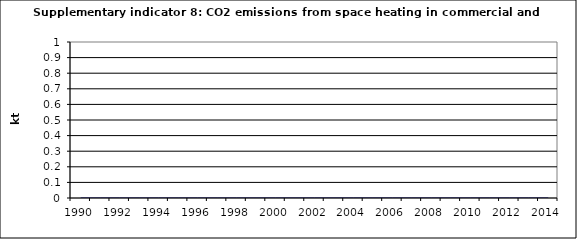
| Category | CO2 emissions from space heating in commercial and institutional, kt |
|---|---|
| 1990 | 0 |
| 1991 | 0 |
| 1992 | 0 |
| 1993 | 0 |
| 1994 | 0 |
| 1995 | 0 |
| 1996 | 0 |
| 1997 | 0 |
| 1998 | 0 |
| 1999 | 0 |
| 2000 | 0 |
| 2001 | 0 |
| 2002 | 0 |
| 2003 | 0 |
| 2004 | 0 |
| 2005 | 0 |
| 2006 | 0 |
| 2007 | 0 |
| 2008 | 0 |
| 2009 | 0 |
| 2010 | 0 |
| 2011 | 0 |
| 2012 | 0 |
| 2013 | 0 |
| 2014 | 0 |